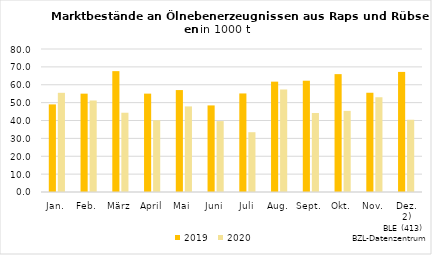
| Category | 2019 | 2020 |
|---|---|---|
| Jan. | 49.004 | 55.488 |
| Feb. | 55.017 | 51.188 |
| März | 67.615 | 44.347 |
| April | 55.032 | 40.141 |
| Mai | 57.029 | 47.879 |
| Juni | 48.442 | 39.661 |
| Juli | 55.135 | 33.447 |
| Aug. | 61.732 | 57.357 |
| Sept. | 62.255 | 44.203 |
| Okt. | 65.943 | 45.381 |
| Nov. | 55.526 | 53.01 |
| Dez. 2) | 67.179 | 40.423 |